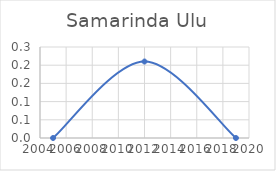
| Category | Series 0 |
|---|---|
| 2005.0 | 0 |
| 2012.0 | 0.21 |
| 2019.0 | 0 |